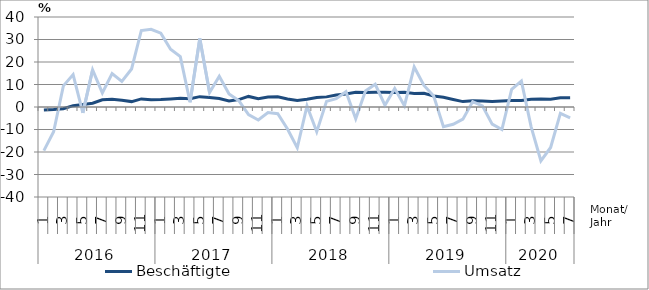
| Category | Beschäftigte | Umsatz |
|---|---|---|
| 0 | -1.3 | -19.4 |
| 1 | -1.1 | -11 |
| 2 | -0.8 | 9.4 |
| 3 | 0.6 | 14.4 |
| 4 | 1.1 | -2.6 |
| 5 | 1.7 | 16.5 |
| 6 | 3.2 | 6.3 |
| 7 | 3.4 | 14.9 |
| 8 | 3 | 11.4 |
| 9 | 2.4 | 16.9 |
| 10 | 3.6 | 34 |
| 11 | 3.2 | 34.5 |
| 12 | 3.3 | 32.8 |
| 13 | 3.6 | 25.7 |
| 14 | 3.9 | 22.4 |
| 15 | 3.7 | 2.1 |
| 16 | 4.6 | 30.4 |
| 17 | 4.2 | 6.4 |
| 18 | 3.8 | 13.7 |
| 19 | 2.7 | 5.8 |
| 20 | 3.3 | 2.8 |
| 21 | 4.7 | -3.4 |
| 22 | 3.7 | -5.8 |
| 23 | 4.4 | -2.5 |
| 24 | 4.5 | -3 |
| 25 | 3.6 | -9.8 |
| 26 | 2.9 | -18.1 |
| 27 | 3.4 | 0.5 |
| 28 | 4.2 | -11 |
| 29 | 4.5 | 2.5 |
| 30 | 5.3 | 3.7 |
| 31 | 5.8 | 6.8 |
| 32 | 6.6 | -5.2 |
| 33 | 6.5 | 7.1 |
| 34 | 6.6 | 10.1 |
| 35 | 6.6 | 0.8 |
| 36 | 6.4 | 8.2 |
| 37 | 6.5 | 0.6 |
| 38 | 6 | 17.8 |
| 39 | 6.1 | 9.6 |
| 40 | 4.9 | 4.9 |
| 41 | 4.3 | -8.8 |
| 42 | 3.3 | -7.7 |
| 43 | 2.4 | -5.4 |
| 44 | 2.8 | 2.4 |
| 45 | 2.7 | 0.5 |
| 46 | 2.5 | -7.6 |
| 47 | 2.7 | -10 |
| 48 | 2.9 | 7.8 |
| 49 | 2.9 | 11.5 |
| 50 | 3.4 | -8.8 |
| 51 | 3.6 | -23.9 |
| 52 | 3.4 | -18 |
| 53 | 4.1 | -2.8 |
| 54 | 4.1 | -4.8 |